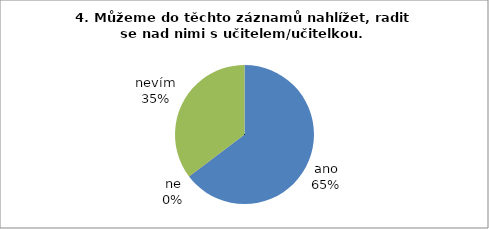
| Category | 4. |
|---|---|
| ano | 22 |
| ne | 0 |
| nevím | 12 |